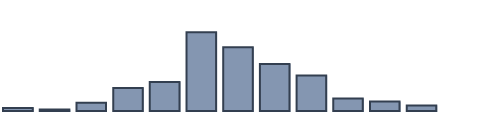
| Category | Series 0 |
|---|---|
| 0 | 0.964 |
| 1 | 0.465 |
| 2 | 2.591 |
| 3 | 7.219 |
| 4 | 9.121 |
| 5 | 24.841 |
| 6 | 20.141 |
| 7 | 14.803 |
| 8 | 11.18 |
| 9 | 3.954 |
| 10 | 2.958 |
| 11 | 1.764 |
| 12 | 0 |